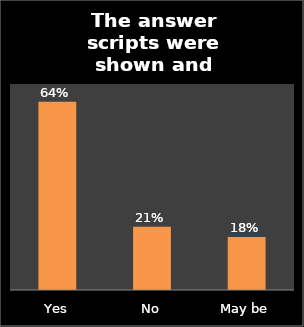
| Category | Series 0 |
|---|---|
| Yes | 0.64 |
| No | 0.215 |
| May be | 0.18 |